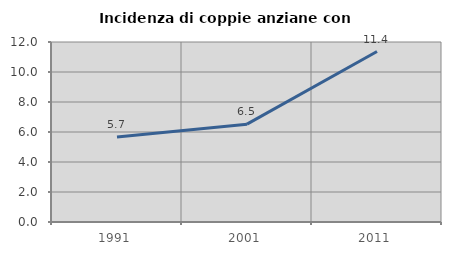
| Category | Incidenza di coppie anziane con figli |
|---|---|
| 1991.0 | 5.66 |
| 2001.0 | 6.522 |
| 2011.0 | 11.364 |